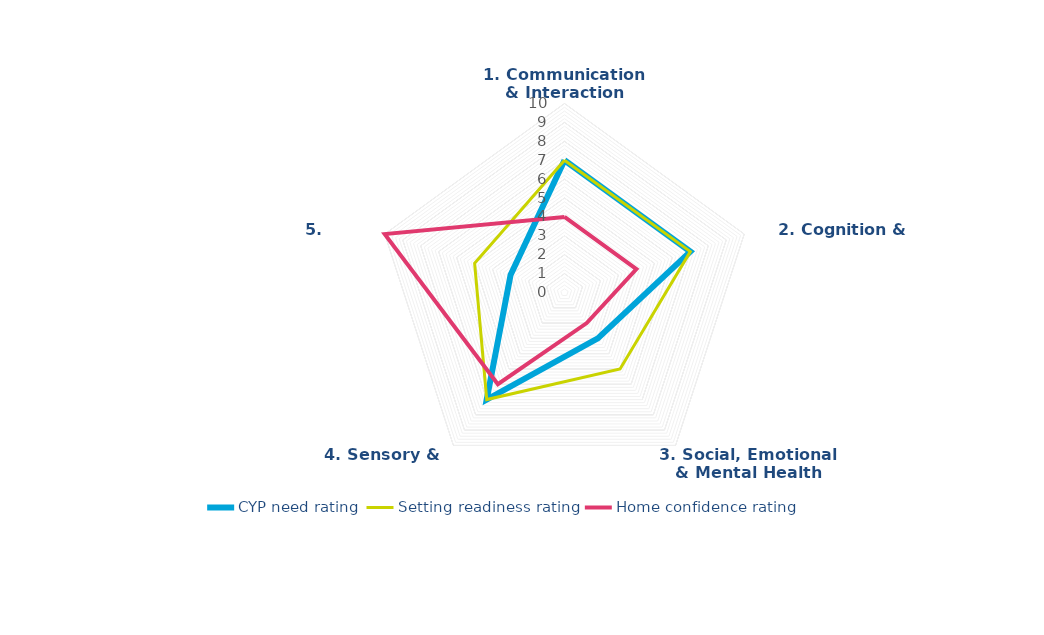
| Category | CYP need rating | Setting readiness rating | Home confidence rating |
|---|---|---|---|
| 1. Communication & Interaction | 7 | 7 | 4 |
| 2. Cognition & Learning | 7 | 7 | 4 |
| 3. Social, Emotional & Mental Health | 3 | 5 | 2 |
| 4. Sensory & Physical | 7 | 7 | 6 |
| 5. Independence | 3 | 5 | 10 |